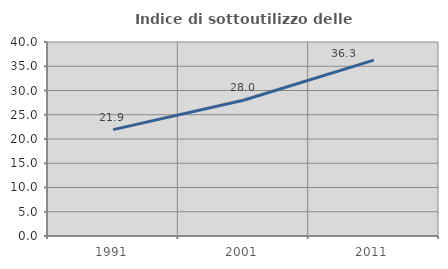
| Category | Indice di sottoutilizzo delle abitazioni  |
|---|---|
| 1991.0 | 21.93 |
| 2001.0 | 28 |
| 2011.0 | 36.264 |